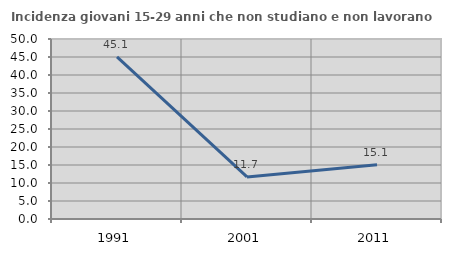
| Category | Incidenza giovani 15-29 anni che non studiano e non lavorano  |
|---|---|
| 1991.0 | 45.058 |
| 2001.0 | 11.684 |
| 2011.0 | 15.094 |